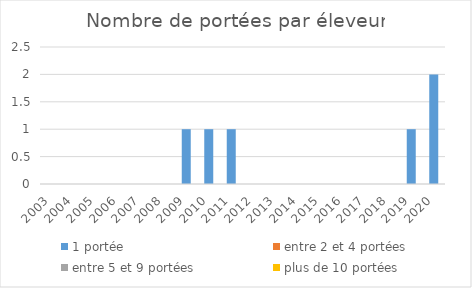
| Category | 1 portée | entre 2 et 4 portées | entre 5 et 9 portées | plus de 10 portées |
|---|---|---|---|---|
| 2003.0 | 0 | 0 | 0 | 0 |
| 2004.0 | 0 | 0 | 0 | 0 |
| 2005.0 | 0 | 0 | 0 | 0 |
| 2006.0 | 0 | 0 | 0 | 0 |
| 2007.0 | 0 | 0 | 0 | 0 |
| 2008.0 | 0 | 0 | 0 | 0 |
| 2009.0 | 1 | 0 | 0 | 0 |
| 2010.0 | 1 | 0 | 0 | 0 |
| 2011.0 | 1 | 0 | 0 | 0 |
| 2012.0 | 0 | 0 | 0 | 0 |
| 2013.0 | 0 | 0 | 0 | 0 |
| 2014.0 | 0 | 0 | 0 | 0 |
| 2015.0 | 0 | 0 | 0 | 0 |
| 2016.0 | 0 | 0 | 0 | 0 |
| 2017.0 | 0 | 0 | 0 | 0 |
| 2018.0 | 0 | 0 | 0 | 0 |
| 2019.0 | 1 | 0 | 0 | 0 |
| 2020.0 | 2 | 0 | 0 | 0 |